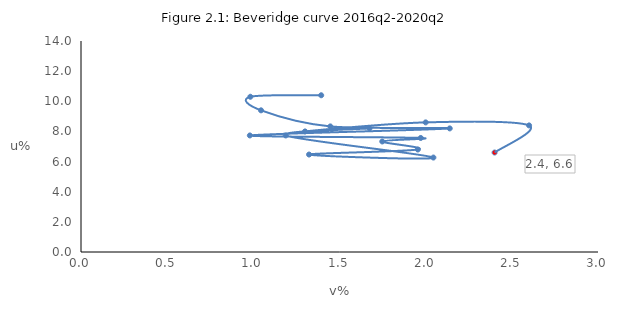
| Category | Unemployment rate |
|---|---|
| 1.393849044636956 | 10.4 |
| 0.9828009828009828 | 10.3 |
| 1.044678693943308 | 9.4 |
| 1.446831472800243 | 8.333 |
| 2.1396418395282573 | 8.2 |
| 0.9797008300002312 | 7.733 |
| 1.971480301232394 | 7.567 |
| 1.7481382797021248 | 7.333 |
| 1.9543884655446522 | 6.8 |
| 1.3233111832042588 | 6.467 |
| 2.044892470054591 | 6.267 |
| 1.1878159917007003 | 7.733 |
| 1.6741280137162213 | 8.2 |
| 1.3 | 8 |
| 2.0 | 8.6 |
| 2.6 | 8.4 |
| 2.4 | 6.6 |